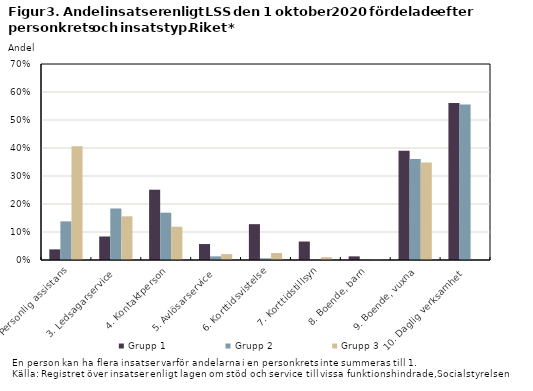
| Category | Grupp 1 | Grupp 2 | Grupp 3 |
|---|---|---|---|
| 2. Personlig assistans | 0.038 | 0.138 | 0.406 |
| 3. Ledsagarservice | 0.084 | 0.184 | 0.156 |
| 4. Kontaktperson | 0.251 | 0.169 | 0.119 |
| 5. Avlösarservice | 0.057 | 0.013 | 0.021 |
| 6. Korttidsvistelse | 0.128 | 0.006 | 0.025 |
| 7. Korttidstillsyn | 0.066 | 0 | 0.01 |
| 8. Boende, barn | 0.013 | 0 | 0.001 |
| 9. Boende, vuxna | 0.39 | 0.361 | 0.348 |
| 10. Daglig verksamhet | 0.561 | 0.555 | 0 |